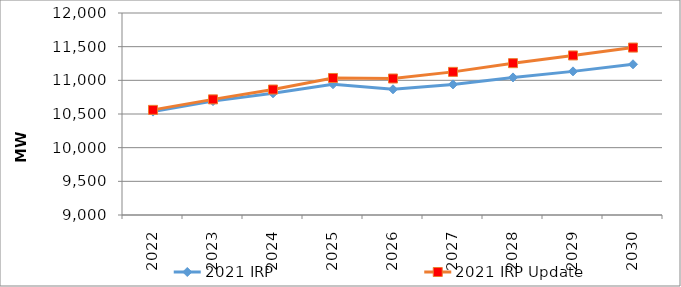
| Category | 2021 IRP | 2021 IRP Update |
|---|---|---|
| 2022.0 | 10535.441 | 10561.334 |
| 2023.0 | 10691.366 | 10717.346 |
| 2024.0 | 10807.838 | 10863.629 |
| 2025.0 | 10942.272 | 11034.897 |
| 2026.0 | 10866.996 | 11027.225 |
| 2027.0 | 10939.547 | 11125.68 |
| 2028.0 | 11043.349 | 11255.033 |
| 2029.0 | 11133.15 | 11369.65 |
| 2030.0 | 11238.494 | 11486.688 |